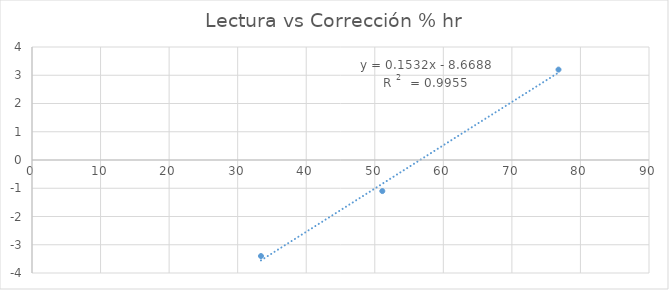
| Category | Corrección % hr |
|---|---|
| 33.4 | -3.4 |
| 51.1 | -1.1 |
| 76.8 | 3.2 |